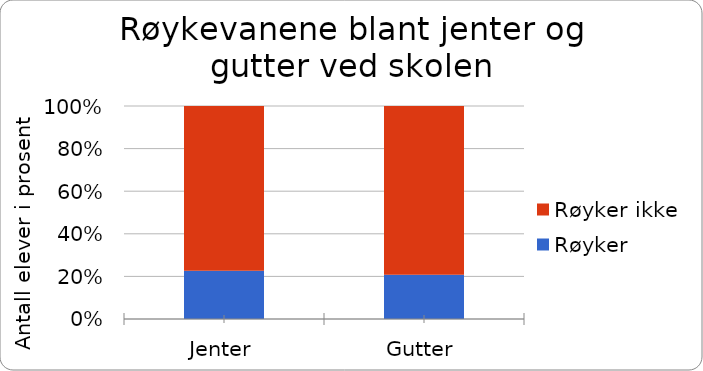
| Category | Røyker | Røyker ikke |
|---|---|---|
| Jenter | 77 | 263 |
| Gutter | 85 | 325 |